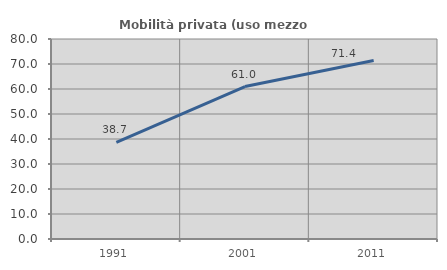
| Category | Mobilità privata (uso mezzo privato) |
|---|---|
| 1991.0 | 38.691 |
| 2001.0 | 60.979 |
| 2011.0 | 71.379 |